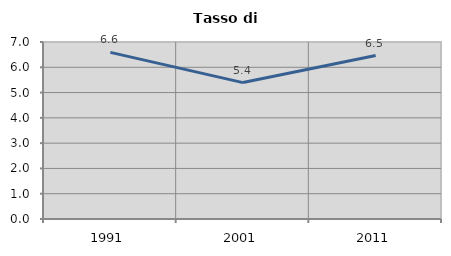
| Category | Tasso di disoccupazione   |
|---|---|
| 1991.0 | 6.591 |
| 2001.0 | 5.395 |
| 2011.0 | 6.464 |